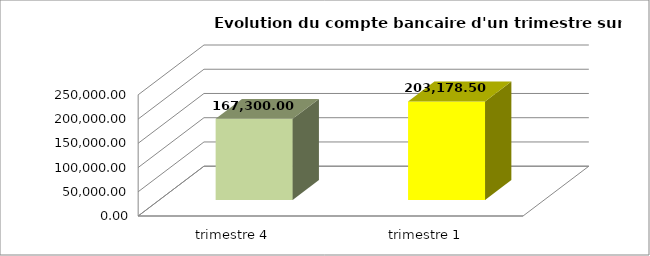
| Category | Series 0 |
|---|---|
| trimestre 4 | 167300 |
| trimestre 1 | 203178.5 |